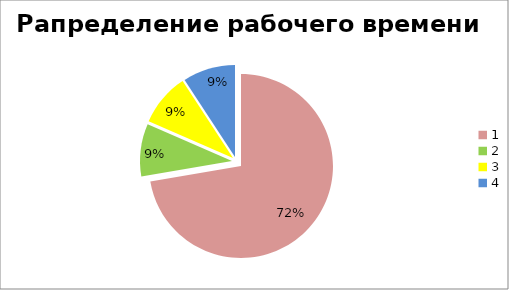
| Category | Series 0 |
|---|---|
| 0 | 0.326 |
| 1 | 0.042 |
| 2 | 0.042 |
| 3 | 0.042 |